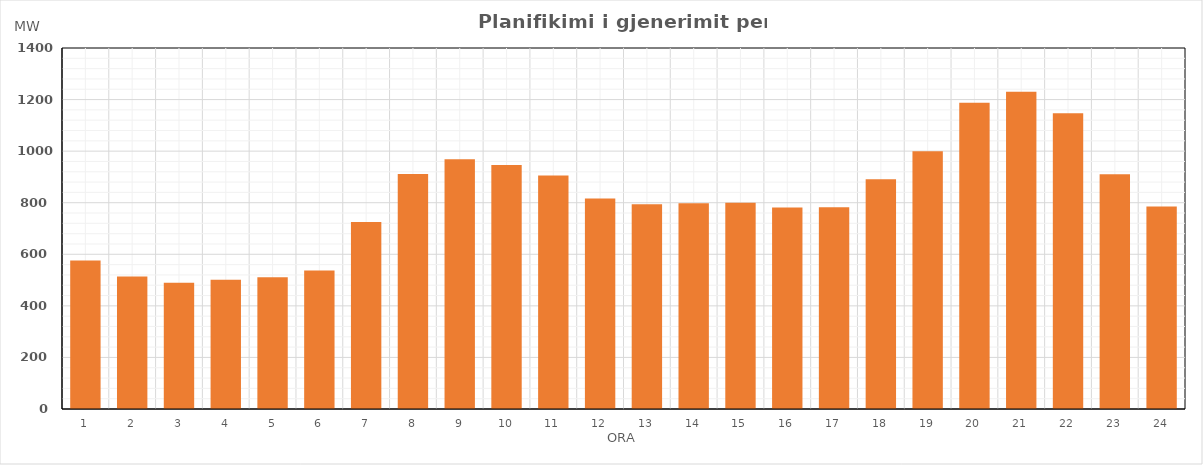
| Category | Max (MW) |
|---|---|
| 0 | 575.49 |
| 1 | 514.28 |
| 2 | 489.96 |
| 3 | 501.05 |
| 4 | 510.86 |
| 5 | 537.47 |
| 6 | 725.06 |
| 7 | 910.97 |
| 8 | 968.1 |
| 9 | 945.86 |
| 10 | 905.07 |
| 11 | 815.96 |
| 12 | 793.82 |
| 13 | 798.13 |
| 14 | 799.44 |
| 15 | 781.47 |
| 16 | 782.1 |
| 17 | 890.79 |
| 18 | 1000.01 |
| 19 | 1187.23 |
| 20 | 1229.87 |
| 21 | 1147.37 |
| 22 | 910.8 |
| 23 | 785.62 |